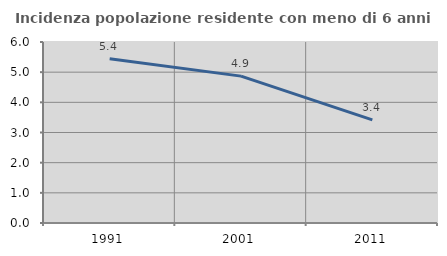
| Category | Incidenza popolazione residente con meno di 6 anni |
|---|---|
| 1991.0 | 5.447 |
| 2001.0 | 4.869 |
| 2011.0 | 3.421 |